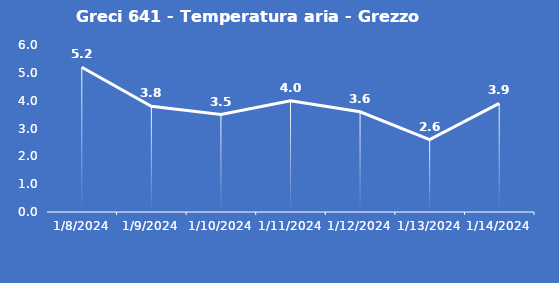
| Category | Greci 641 - Temperatura aria - Grezzo (°C) |
|---|---|
| 1/8/24 | 5.2 |
| 1/9/24 | 3.8 |
| 1/10/24 | 3.5 |
| 1/11/24 | 4 |
| 1/12/24 | 3.6 |
| 1/13/24 | 2.6 |
| 1/14/24 | 3.9 |